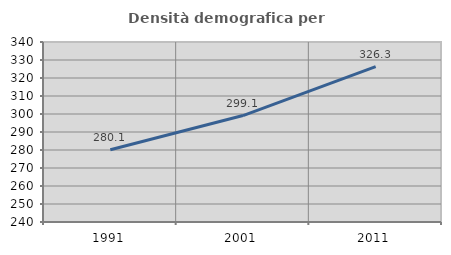
| Category | Densità demografica |
|---|---|
| 1991.0 | 280.147 |
| 2001.0 | 299.137 |
| 2011.0 | 326.303 |